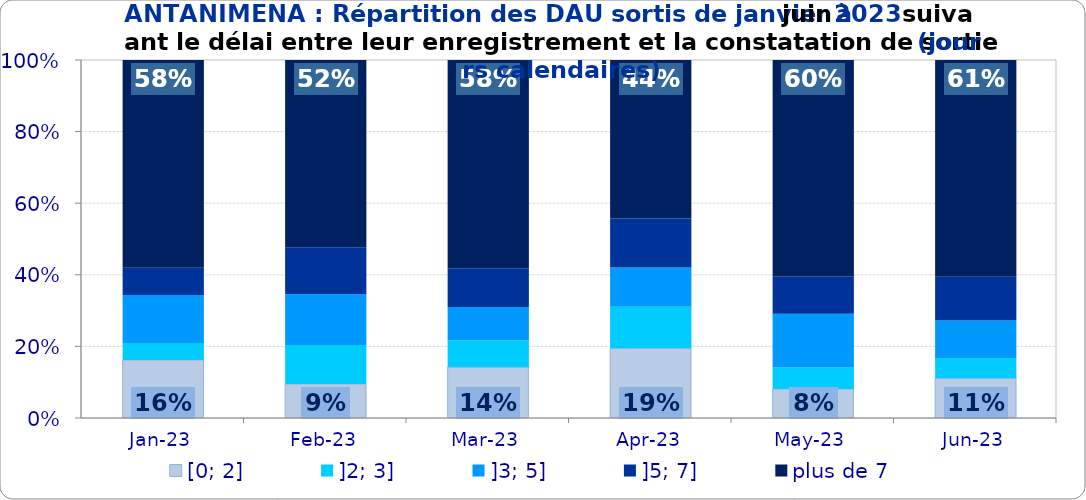
| Category | [0; 2] | ]2; 3] | ]3; 5] | ]5; 7] | plus de 7 |
|---|---|---|---|---|---|
| 2023-01-01 | 0.162 | 0.048 | 0.134 | 0.076 | 0.58 |
| 2023-02-01 | 0.095 | 0.109 | 0.142 | 0.131 | 0.523 |
| 2023-03-01 | 0.142 | 0.075 | 0.093 | 0.109 | 0.581 |
| 2023-04-01 | 0.195 | 0.116 | 0.109 | 0.137 | 0.442 |
| 2023-05-01 | 0.081 | 0.06 | 0.15 | 0.105 | 0.604 |
| 2023-06-01 | 0.111 | 0.057 | 0.104 | 0.123 | 0.605 |